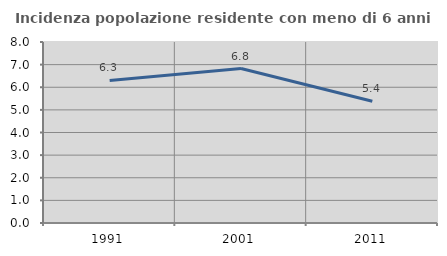
| Category | Incidenza popolazione residente con meno di 6 anni |
|---|---|
| 1991.0 | 6.3 |
| 2001.0 | 6.828 |
| 2011.0 | 5.385 |